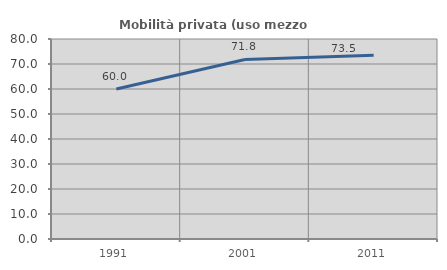
| Category | Mobilità privata (uso mezzo privato) |
|---|---|
| 1991.0 | 59.967 |
| 2001.0 | 71.821 |
| 2011.0 | 73.502 |